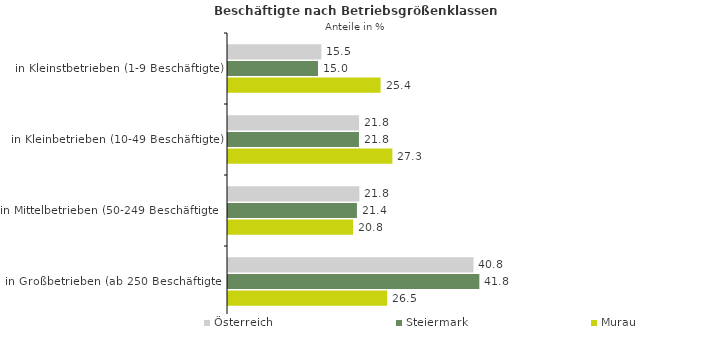
| Category | Österreich | Steiermark | Murau |
|---|---|---|---|
| in Kleinstbetrieben (1-9 Beschäftigte) | 15.526 | 14.966 | 25.378 |
| in Kleinbetrieben (10-49 Beschäftigte) | 21.796 | 21.781 | 27.339 |
| in Mittelbetrieben (50-249 Beschäftigte) | 21.849 | 21.447 | 20.807 |
| in Großbetrieben (ab 250 Beschäftigte) | 40.829 | 41.806 | 26.476 |